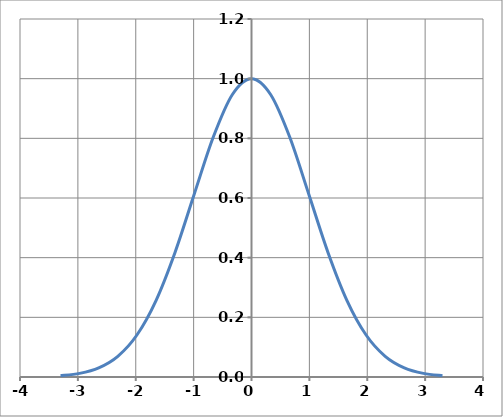
| Category | y |
|---|---|
| -3.3 | 0.004 |
| -2.9699999999999998 | 0.012 |
| -2.6399999999999997 | 0.031 |
| -2.3099999999999996 | 0.069 |
| -1.9799999999999998 | 0.141 |
| -1.65 | 0.256 |
| -1.3199999999999998 | 0.418 |
| -0.9899999999999999 | 0.613 |
| -0.6599999999999999 | 0.804 |
| -0.32999999999999996 | 0.947 |
| 0.0 | 1 |
| 0.32999999999999996 | 0.947 |
| 0.6599999999999999 | 0.804 |
| 0.9899999999999999 | 0.613 |
| 1.3199999999999998 | 0.418 |
| 1.65 | 0.256 |
| 1.9799999999999998 | 0.141 |
| 2.3099999999999996 | 0.069 |
| 2.6399999999999997 | 0.031 |
| 2.9699999999999998 | 0.012 |
| 3.3 | 0.004 |